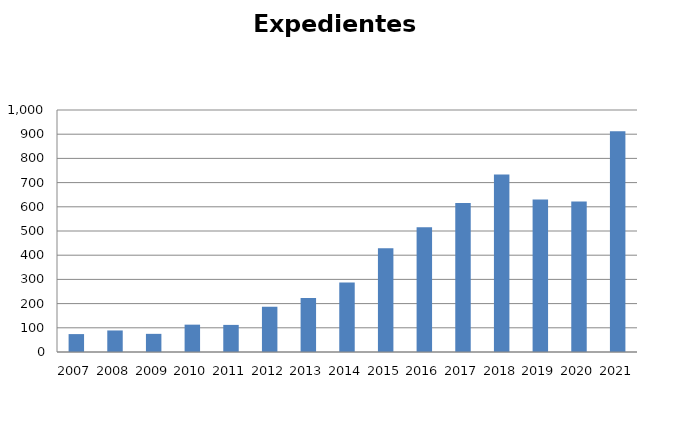
| Category | Expedientes Gubernativos |
|---|---|
| 2007.0 | 74 |
| 2008.0 | 89 |
| 2009.0 | 75 |
| 2010.0 | 113 |
| 2011.0 | 112 |
| 2012.0 | 187 |
| 2013.0 | 223 |
| 2014.0 | 287 |
| 2015.0 | 429 |
| 2016.0 | 515 |
| 2017.0 | 616 |
| 2018.0 | 733 |
| 2019.0 | 630 |
| 2020.0 | 622 |
| 2021.0 | 912 |